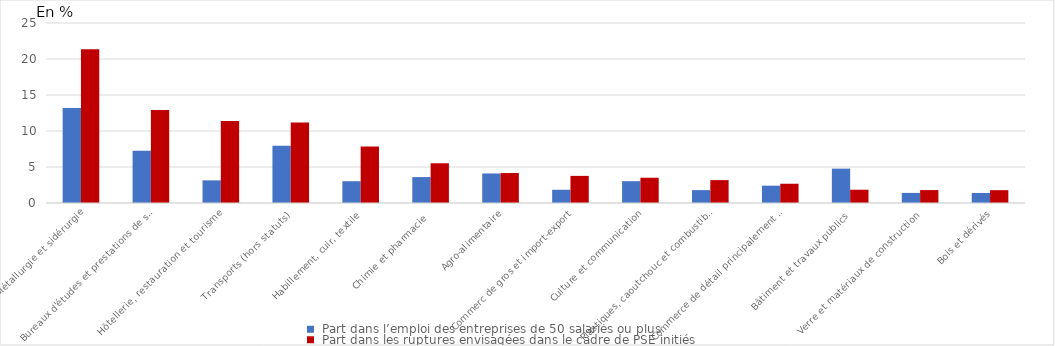
| Category |  Part dans l’emploi des entreprises de 50 salariés ou plus |  Part dans les ruptures envisagées dans le cadre de PSE initiés |
|---|---|---|
| Métallurgie et sidérurgie | 13.183 | 21.359 |
| Bureaux d'études et prestations de services aux entreprises  | 7.25 | 12.903 |
| Hôtellerie, restauration et tourisme  | 3.146 | 11.372 |
| Transports (hors statuts)  | 7.938 | 11.169 |
| Habillement, cuir, textile  | 3.025 | 7.835 |
| Chimie et pharmacie  | 3.6 | 5.519 |
| Agro-alimentaire | 4.101 | 4.159 |
| Commerc de gros et import-export | 1.836 | 3.767 |
| Culture et communication | 3.032 | 3.509 |
| Plastiques, caoutchouc et combustibles | 1.789 | 3.174 |
| Commerce de détail principalement non alimentaire | 2.407 | 2.676 |
| Bâtiment et travaux publics | 4.772 | 1.843 |
| Verre et matériaux de construction | 1.402 | 1.794 |
| Bois et dérivés | 1.395 | 1.783 |